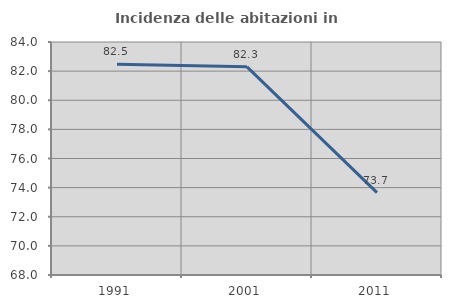
| Category | Incidenza delle abitazioni in proprietà  |
|---|---|
| 1991.0 | 82.479 |
| 2001.0 | 82.297 |
| 2011.0 | 73.659 |